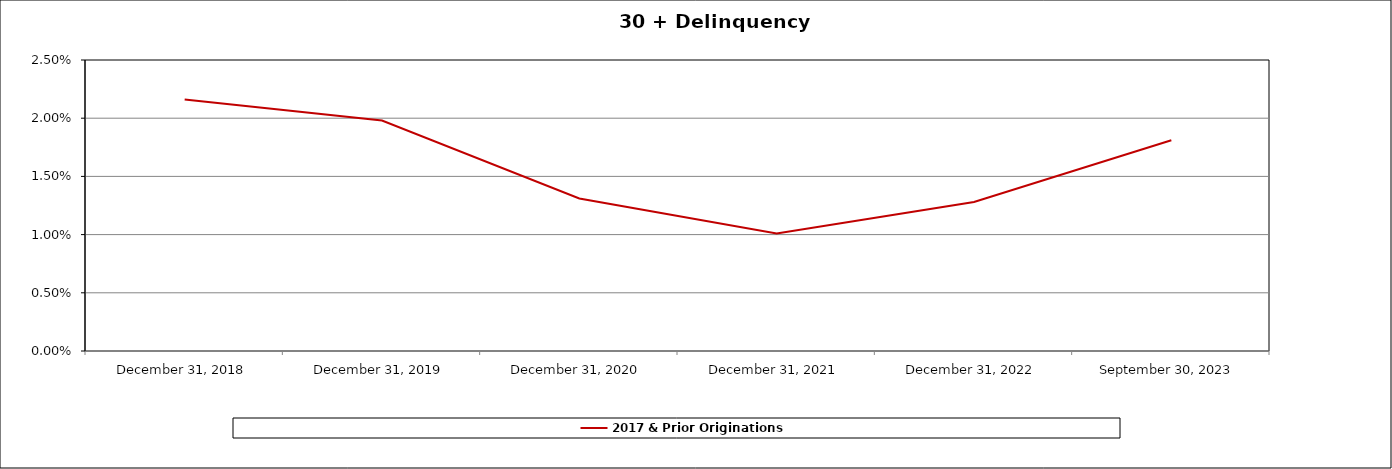
| Category | 2017 & Prior Originations |
|---|---|
| December 31, 2018 | 0.022 |
| December 31, 2019 | 0.02 |
| December 31, 2020 | 0.013 |
| December 31, 2021 | 0.01 |
| December 31, 2022 | 0.013 |
| September 30, 2023 | 0.018 |